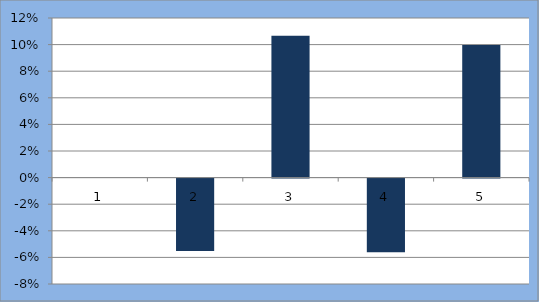
| Category | Series 0 |
|---|---|
| 0 | 0 |
| 1 | -0.054 |
| 2 | 0.107 |
| 3 | -0.055 |
| 4 | 0.1 |